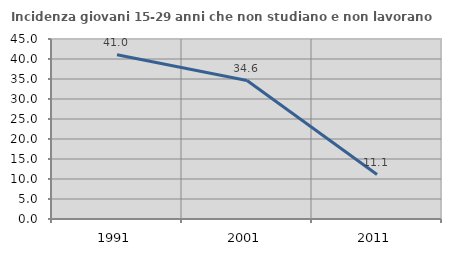
| Category | Incidenza giovani 15-29 anni che non studiano e non lavorano  |
|---|---|
| 1991.0 | 41.039 |
| 2001.0 | 34.615 |
| 2011.0 | 11.111 |